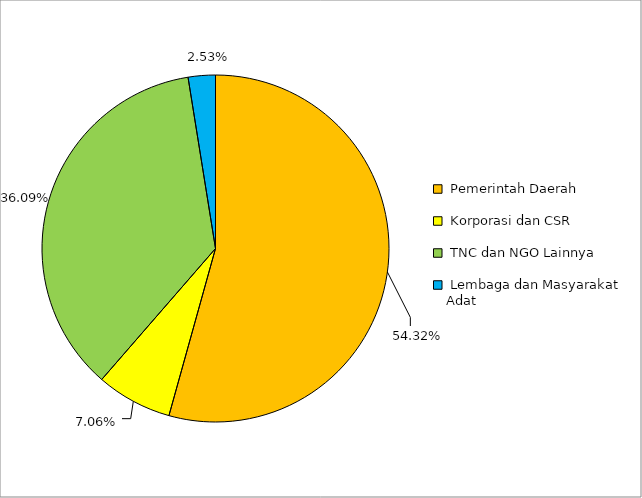
| Category | Series 0 |
|---|---|
|  Pemerintah Daerah  | 0.543 |
|  Korporasi dan CSR  | 0.071 |
|  TNC dan NGO Lainnya  | 0.361 |
|  Lembaga dan Masyarakat Adat  | 0.025 |